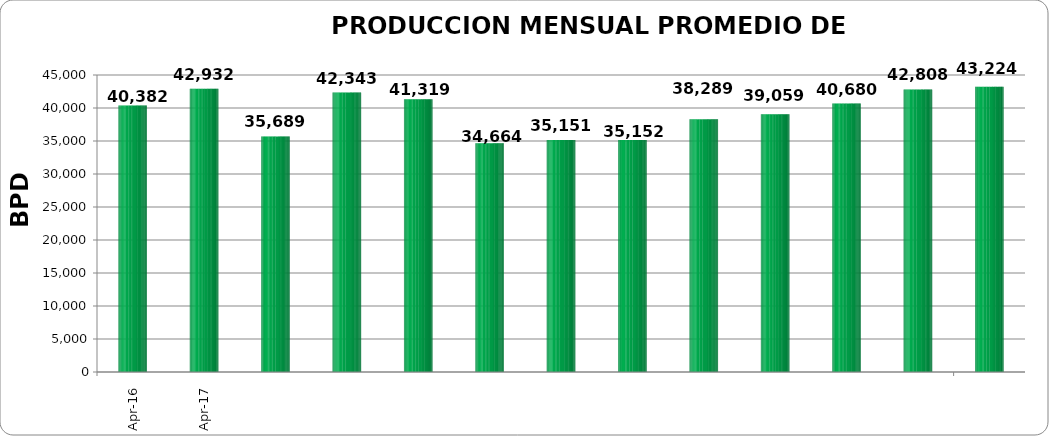
| Category | TOTAL PAIS 
(BPD) #¡REF! #¡REF! #¡REF! #¡REF! #¡REF! #¡REF! #¡REF! #¡REF! #¡REF! #¡REF! #¡REF! #¡REF! #¡REF! #¡REF! #¡REF! #¡REF! #¡REF! #¡REF! #¡REF! #¡REF! #¡REF! #¡REF! #¡REF! #¡REF! #¡REF! #¡REF! #¡REF! #¡REF! #¡REF! #¡REF! #¡REF! #¡REF! #¡REF! #¡REF! |
|---|---|
| 2016-04-01 | 40382 |
| 2016-05-01 | 42932.129 |
| 2016-06-01 | 35689.484 |
| 2016-07-01 | 42342.774 |
| 2016-08-01 | 41318.968 |
| 2016-09-01 | 34664.167 |
| 2016-10-01 | 35151.065 |
| 2016-11-01 | 35152.433 |
| 2016-12-01 | 38288.645 |
| 2017-01-01 | 39058.903 |
| 2017-02-01 | 40679.714 |
| 2017-03-01 | 42807.645 |
| 2017-04-01 | 43223.567 |